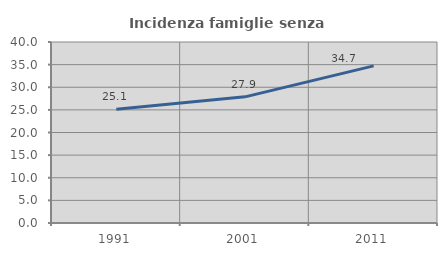
| Category | Incidenza famiglie senza nuclei |
|---|---|
| 1991.0 | 25.117 |
| 2001.0 | 27.875 |
| 2011.0 | 34.719 |